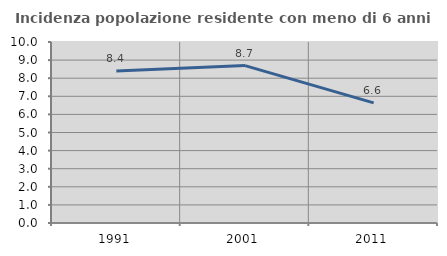
| Category | Incidenza popolazione residente con meno di 6 anni |
|---|---|
| 1991.0 | 8.395 |
| 2001.0 | 8.697 |
| 2011.0 | 6.637 |